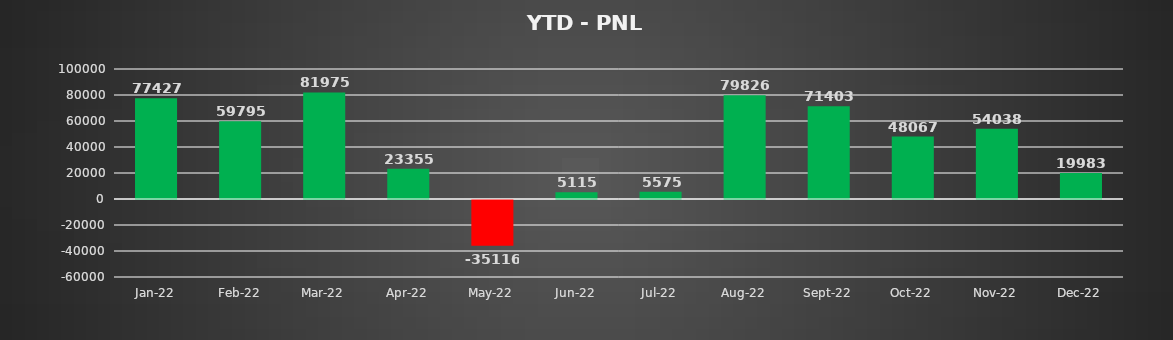
| Category | Series 1 |
|---|---|
| 2022-01-01 | 77426.7 |
| 2022-02-01 | 59795 |
| 2022-03-01 | 81975 |
| 2022-04-01 | 23355.05 |
| 2022-05-01 | -35116.2 |
| 2022-06-01 | 5115 |
| 2022-07-01 | 5575 |
| 2022-08-01 | 79826.2 |
| 2022-09-01 | 71402.6 |
| 2022-10-01 | 48067.5 |
| 2022-11-01 | 54038 |
| 2022-12-01 | 19982.5 |